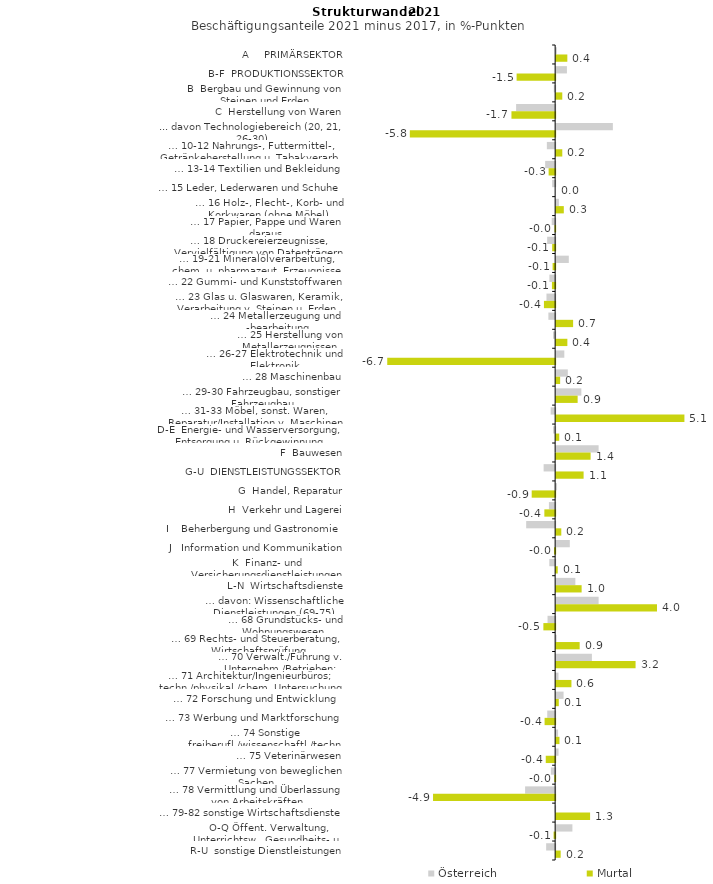
| Category | Österreich | Murtal |
|---|---|---|
| A     PRIMÄRSEKTOR | 0.029 | 0.445 |
| B-F  PRODUKTIONSSEKTOR | 0.429 | -1.532 |
| B  Bergbau und Gewinnung von Steinen und Erden | -0.054 | 0.244 |
| C  Herstellung von Waren | -1.552 | -1.738 |
| ... davon Technologiebereich (20, 21, 26-30) | 2.256 | -5.78 |
| … 10-12 Nahrungs-, Futtermittel-, Getränkeherstellung u. Tabakverarb. | -0.33 | 0.245 |
| … 13-14 Textilien und Bekleidung | -0.397 | -0.26 |
| … 15 Leder, Lederwaren und Schuhe | -0.119 | 0 |
| … 16 Holz-, Flecht-, Korb- und Korkwaren (ohne Möbel)  | 0.11 | 0.305 |
| … 17 Papier, Pappe und Waren daraus  | -0.136 | -0.027 |
| … 18 Druckereierzeugnisse, Vervielfältigung von Datenträgern | -0.317 | -0.118 |
| … 19-21 Mineralölverarbeitung, chem. u. pharmazeut. Erzeugnisse | 0.503 | -0.101 |
| … 22 Gummi- und Kunststoffwaren | -0.229 | -0.128 |
| … 23 Glas u. Glaswaren, Keramik, Verarbeitung v. Steinen u. Erden  | -0.345 | -0.446 |
| … 24 Metallerzeugung und -bearbeitung | -0.269 | 0.675 |
| … 25 Herstellung von Metallerzeugnissen  | -0.086 | 0.446 |
| … 26-27 Elektrotechnik und Elektronik | 0.325 | -6.678 |
| … 28 Maschinenbau | 0.465 | 0.159 |
| … 29-30 Fahrzeugbau, sonstiger Fahrzeugbau | 1.003 | 0.855 |
| … 31-33 Möbel, sonst. Waren, Reparatur/Installation v. Maschinen | -0.178 | 5.102 |
| D-E  Energie- und Wasserversorgung, Entsorgung u. Rückgewinnung | -0.083 | 0.123 |
| F  Bauwesen | 1.689 | 1.371 |
| G-U  DIENSTLEISTUNGSSEKTOR | -0.458 | 1.092 |
| G  Handel, Reparatur | 0.035 | -0.932 |
| H  Verkehr und Lagerei | -0.247 | -0.429 |
| I    Beherbergung und Gastronomie | -1.152 | 0.205 |
| J   Information und Kommunikation | 0.543 | -0.047 |
| K  Finanz- und Versicherungsdienstleistungen | -0.232 | 0.064 |
| L-N  Wirtschaftsdienste | 0.764 | 1.014 |
| … davon: Wissenschaftliche Dienstleistungen (69-75) | 1.689 | 4.011 |
| … 68 Grundstücks- und Wohnungswesen  | -0.302 | -0.468 |
| … 69 Rechts- und Steuerberatung, Wirtschaftsprüfung | 0.021 | 0.935 |
| … 70 Verwalt./Führung v. Unternehm./Betrieben; Unternehmensberat. | 1.422 | 3.159 |
| … 71 Architektur/Ingenieurbüros; techn./physikal./chem. Untersuchung | 0.093 | 0.608 |
| … 72 Forschung und Entwicklung  | 0.296 | 0.105 |
| … 73 Werbung und Marktforschung | -0.315 | -0.42 |
| … 74 Sonstige freiberufl./wissenschaftl./techn. Tätigkeiten | 0.077 | 0.132 |
| … 75 Veterinärwesen | 0.095 | -0.374 |
| … 77 Vermietung von beweglichen Sachen  | -0.17 | -0.036 |
| … 78 Vermittlung und Überlassung von Arbeitskräften | -1.195 | -4.857 |
| … 79-82 sonstige Wirtschaftsdienste | -0.022 | 1.35 |
| O-Q Öffent. Verwaltung, Unterrichtsw., Gesundheits- u. Sozialwesen | 0.646 | -0.062 |
| R-U  sonstige Dienstleistungen | -0.357 | 0.181 |